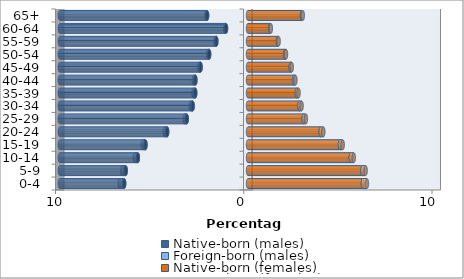
| Category | Native-born (males) | Foreign-born (males) | Native-born (females) | Foreign-born (females) |
|---|---|---|---|---|
| 0-4 | -6.579 | -0.235 | 6.102 | 0.216 |
| 5-9 | -6.497 | -0.185 | 6.072 | 0.176 |
| 10-14 | -5.852 | -0.164 | 5.459 | 0.16 |
| 15-19 | -5.447 | -0.147 | 4.887 | 0.145 |
| 20-24 | -4.294 | -0.131 | 3.862 | 0.139 |
| 25-29 | -3.254 | -0.113 | 2.951 | 0.125 |
| 30-34 | -2.941 | -0.105 | 2.737 | 0.11 |
| 35-39 | -2.803 | -0.092 | 2.598 | 0.087 |
| 40-44 | -2.795 | -0.079 | 2.446 | 0.073 |
| 45-49 | -2.519 | -0.067 | 2.267 | 0.058 |
| 50-54 | -2.064 | -0.055 | 1.971 | 0.048 |
| 55-59 | -1.681 | -0.044 | 1.585 | 0.041 |
| 60-64 | -1.169 | -0.039 | 1.178 | 0.035 |
| 65+ | -2.172 | -0.039 | 2.863 | 0.047 |